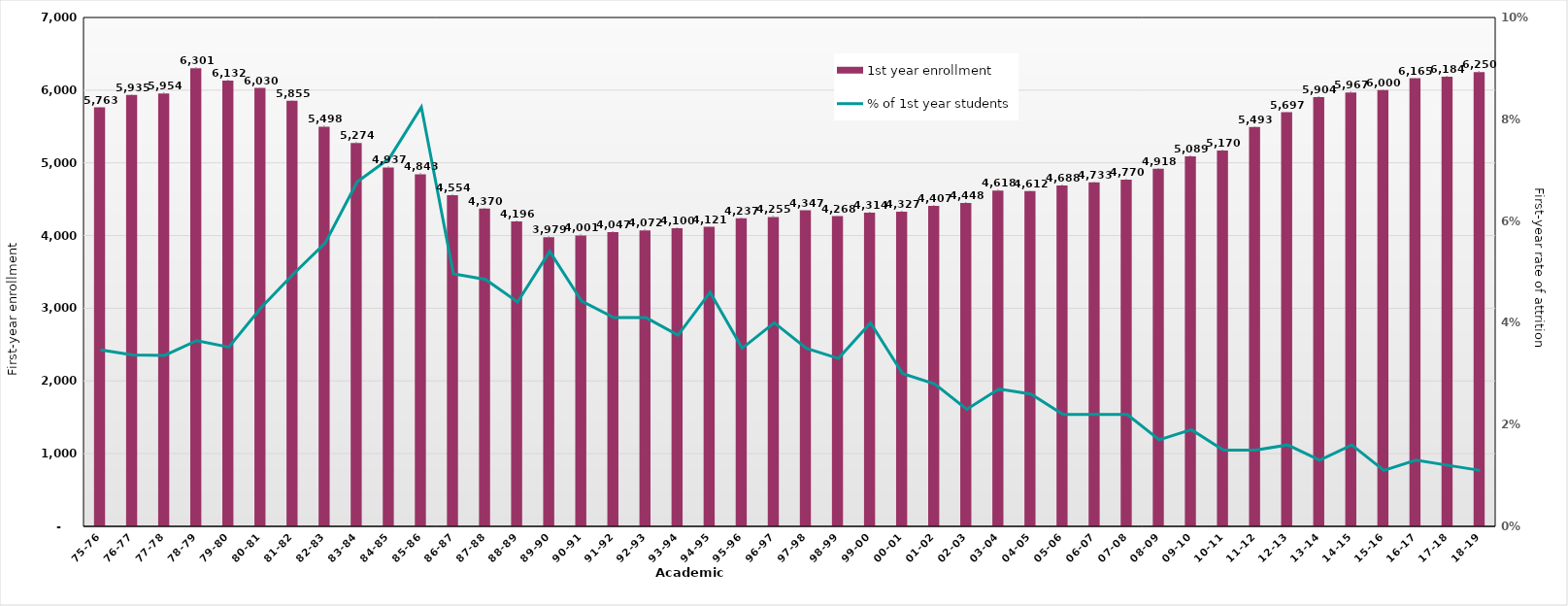
| Category | 1st year enrollment |
|---|---|
| 75-76 | 5763 |
| 76-77 | 5935 |
| 77-78 | 5954 |
| 78-79 | 6301 |
| 79-80 | 6132 |
| 80-81 | 6030 |
| 81-82 | 5855 |
| 82-83 | 5498 |
| 83-84 | 5274 |
| 84-85 | 4937 |
| 85-86 | 4843 |
| 86-87 | 4554 |
| 87-88 | 4370 |
| 88-89 | 4196 |
| 89-90 | 3979 |
| 90-91 | 4001 |
| 91-92 | 4047 |
| 92-93 | 4072 |
| 93-94 | 4100 |
| 94-95 | 4121 |
| 95-96 | 4237 |
| 96-97 | 4255 |
| 97-98 | 4347 |
| 98-99 | 4268 |
| 99-00 | 4314 |
| 00-01 | 4327 |
| 01-02 | 4407 |
| 02-03 | 4448 |
| 03-04 | 4618 |
| 04-05 | 4612 |
| 05-06 | 4688 |
| 06-07 | 4733 |
| 07-08 | 4770 |
| 08-09 | 4918 |
| 09-10 | 5089 |
| 10-11 | 5170 |
| 11-12 | 5493 |
| 12-13 | 5697 |
| 13-14 | 5904 |
| 14-15 | 5967 |
| 15-16 | 6000 |
| 16-17 | 6165 |
| 17-18 | 6184 |
| 18-19 | 6250 |